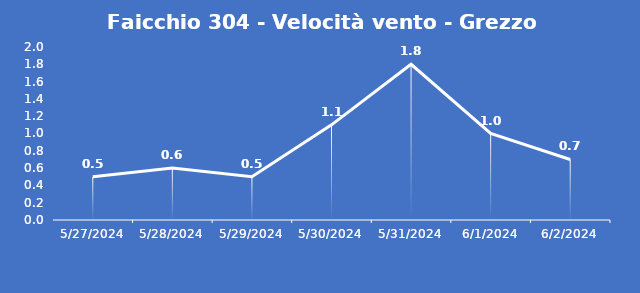
| Category | Faicchio 304 - Velocità vento - Grezzo (m/s) |
|---|---|
| 5/27/24 | 0.5 |
| 5/28/24 | 0.6 |
| 5/29/24 | 0.5 |
| 5/30/24 | 1.1 |
| 5/31/24 | 1.8 |
| 6/1/24 | 1 |
| 6/2/24 | 0.7 |